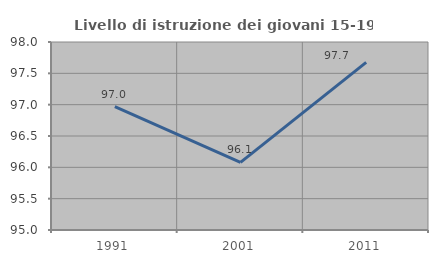
| Category | Livello di istruzione dei giovani 15-19 anni |
|---|---|
| 1991.0 | 96.97 |
| 2001.0 | 96.078 |
| 2011.0 | 97.674 |